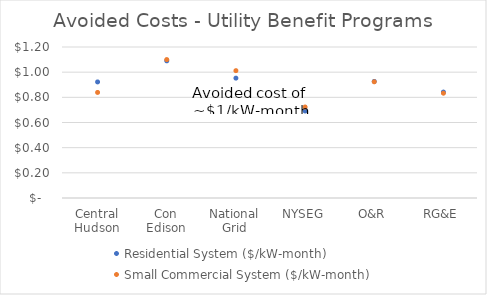
| Category | Residential System ($/kW-month) | Small Commercial System ($/kW-month) |
|---|---|---|
| Central Hudson | 0.922 | 0.839 |
| Con Edison | 1.09 | 1.1 |
| National Grid | 0.953 | 1.012 |
| NYSEG | 0.691 | 0.723 |
| O&R | 0.927 | 0.924 |
| RG&E | 0.842 | 0.833 |